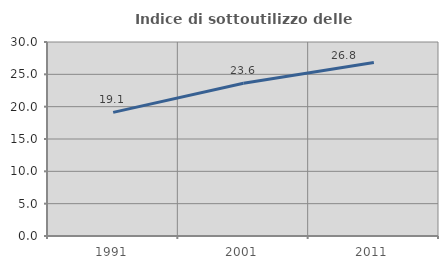
| Category | Indice di sottoutilizzo delle abitazioni  |
|---|---|
| 1991.0 | 19.118 |
| 2001.0 | 23.623 |
| 2011.0 | 26.819 |